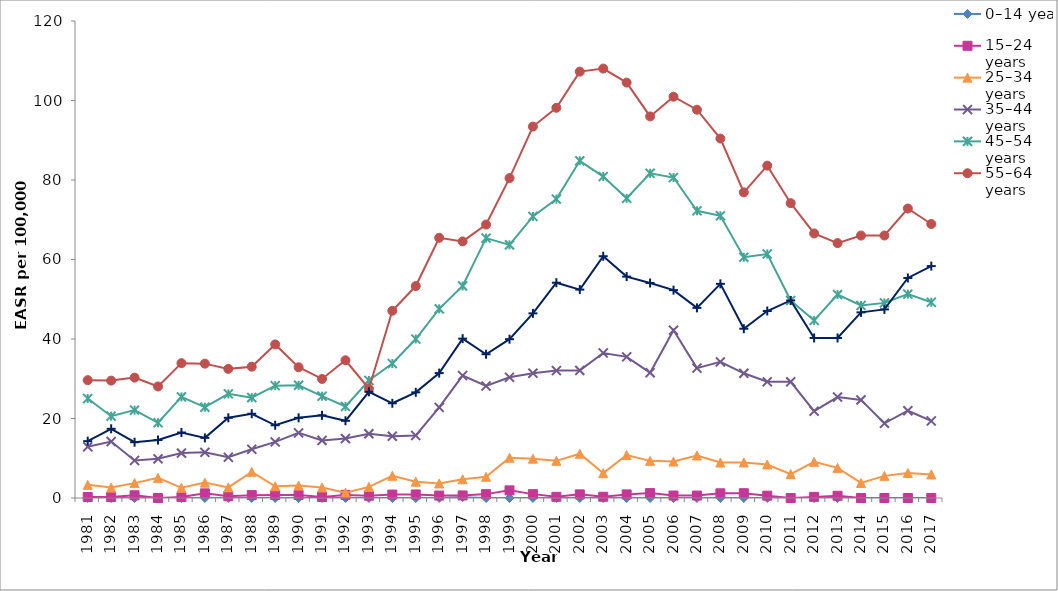
| Category | 0–14 years | 15–24 years | 25–34 years | 35–44 years | 45–54 years | 55–64 years | 65 + years |
|---|---|---|---|---|---|---|---|
| 1981.0 | 0 | 0.248 | 3.305 | 12.883 | 25.029 | 29.651 | 14.3 |
| 1982.0 | 0 | 0.243 | 2.617 | 14.204 | 20.584 | 29.535 | 17.406 |
| 1983.0 | 0 | 0.685 | 3.746 | 9.434 | 22.111 | 30.286 | 14.031 |
| 1984.0 | 0 | 0 | 5.062 | 9.854 | 18.929 | 28.06 | 14.583 |
| 1985.0 | 0 | 0.232 | 2.564 | 11.296 | 25.434 | 33.924 | 16.476 |
| 1986.0 | 0 | 1.168 | 3.863 | 11.498 | 22.838 | 33.801 | 15.129 |
| 1987.0 | 0 | 0.466 | 2.672 | 10.253 | 26.195 | 32.486 | 20.176 |
| 1988.0 | 0 | 0.72 | 6.587 | 12.248 | 25.249 | 33.035 | 21.199 |
| 1989.0 | 0 | 0.744 | 2.954 | 14.125 | 28.262 | 38.638 | 18.295 |
| 1990.0 | 0 | 0.754 | 3.123 | 16.385 | 28.362 | 32.899 | 20.168 |
| 1991.0 | 0 | 0.254 | 2.665 | 14.483 | 25.61 | 29.954 | 20.792 |
| 1992.0 | 0 | 0.785 | 1.346 | 14.946 | 23.03 | 34.651 | 19.428 |
| 1993.0 | 0 | 0.575 | 2.798 | 16.162 | 29.569 | 27.484 | 26.709 |
| 1994.0 | 0 | 0.868 | 5.59 | 15.546 | 33.826 | 47.092 | 23.83 |
| 1995.0 | 0 | 0.892 | 4.111 | 15.736 | 39.997 | 53.321 | 26.582 |
| 1996.0 | 0 | 0.616 | 3.654 | 22.792 | 47.596 | 65.459 | 31.423 |
| 1997.0 | 0.211 | 0.652 | 4.719 | 30.796 | 53.34 | 64.552 | 40.084 |
| 1998.0 | 0 | 0.977 | 5.34 | 28.18 | 65.38 | 68.794 | 36.166 |
| 1999.0 | 0 | 1.919 | 10.128 | 30.357 | 63.687 | 80.478 | 39.95 |
| 2000.0 | 0 | 0.975 | 9.897 | 31.392 | 70.841 | 93.443 | 46.449 |
| 2001.0 | 0 | 0.297 | 9.346 | 32.048 | 75.204 | 98.164 | 54.16 |
| 2002.0 | 0 | 0.914 | 11.139 | 32.097 | 84.821 | 107.267 | 52.431 |
| 2003.0 | 0 | 0.318 | 6.249 | 36.487 | 80.867 | 108.033 | 60.82 |
| 2004.0 | 0 | 0.902 | 10.811 | 35.502 | 75.4 | 104.508 | 55.7 |
| 2005.0 | 0 | 1.234 | 9.345 | 31.526 | 81.686 | 95.998 | 54.086 |
| 2006.0 | 0 | 0.623 | 9.16 | 42.207 | 80.619 | 100.945 | 52.29 |
| 2007.0 | 0 | 0.617 | 10.698 | 32.672 | 72.253 | 97.675 | 47.832 |
| 2008.0 | 0 | 1.181 | 8.935 | 34.239 | 70.998 | 90.429 | 53.877 |
| 2009.0 | 0 | 1.204 | 8.945 | 31.377 | 60.578 | 76.892 | 42.589 |
| 2010.0 | 0 | 0.593 | 8.428 | 29.236 | 61.387 | 83.608 | 47.045 |
| 2011.0 | 0 | 0 | 6.013 | 29.229 | 49.674 | 74.173 | 49.699 |
| 2012.0 | 0 | 0.282 | 9.102 | 21.837 | 44.673 | 66.557 | 40.259 |
| 2013.0 | 0 | 0.566 | 7.571 | 25.393 | 51.177 | 64.131 | 40.264 |
| 2014.0 | 0 | 0 | 3.796 | 24.676 | 48.438 | 66.026 | 46.699 |
| 2015.0 | 0 | 0 | 5.569 | 18.787 | 49.089 | 66.035 | 47.447 |
| 2016.0 | 0 | 0 | 6.288 | 21.958 | 51.286 | 72.829 | 55.354 |
| 2017.0 | 0 | 0 | 5.937 | 19.383 | 49.245 | 68.934 | 58.34 |